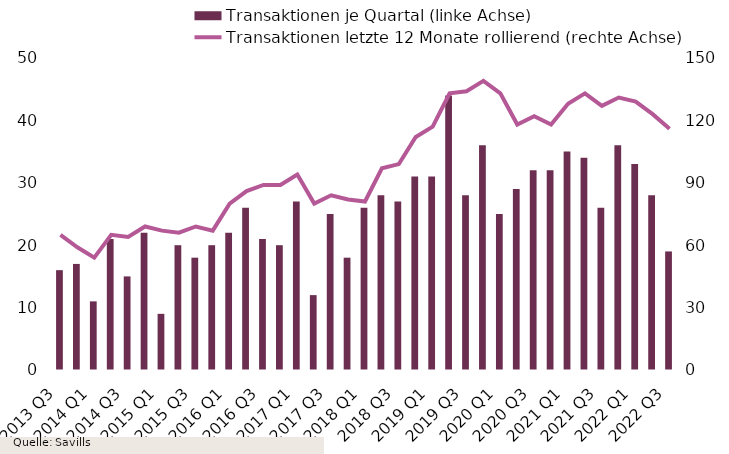
| Category | Transaktionen je Quartal (linke Achse) |
|---|---|
| 2013 Q3 | 16 |
| 2013 Q4 | 17 |
| 2014 Q1 | 11 |
| 2014 Q2 | 21 |
| 2014 Q3 | 15 |
| 2014 Q4 | 22 |
| 2015 Q1 | 9 |
| 2015 Q2 | 20 |
| 2015 Q3 | 18 |
| 2015 Q4 | 20 |
| 2016 Q1 | 22 |
| 2016 Q2 | 26 |
| 2016 Q3 | 21 |
| 2016 Q4 | 20 |
| 2017 Q1 | 27 |
| 2017 Q2 | 12 |
| 2017 Q3 | 25 |
| 2017 Q4 | 18 |
| 2018 Q1 | 26 |
| 2018 Q2 | 28 |
| 2018 Q3 | 27 |
| 2018 Q4 | 31 |
| 2019 Q1 | 31 |
| 2019 Q2 | 44 |
| 2019 Q3 | 28 |
| 2019 Q4 | 36 |
| 2020 Q1 | 25 |
| 2020 Q2 | 29 |
| 2020 Q3 | 32 |
| 2020 Q4 | 32 |
| 2021 Q1 | 35 |
| 2021 Q2 | 34 |
| 2021 Q3 | 26 |
| 2021 Q4 | 36 |
| 2022 Q1 | 33 |
| 2022 Q2 | 28 |
| 2022 Q3 | 19 |